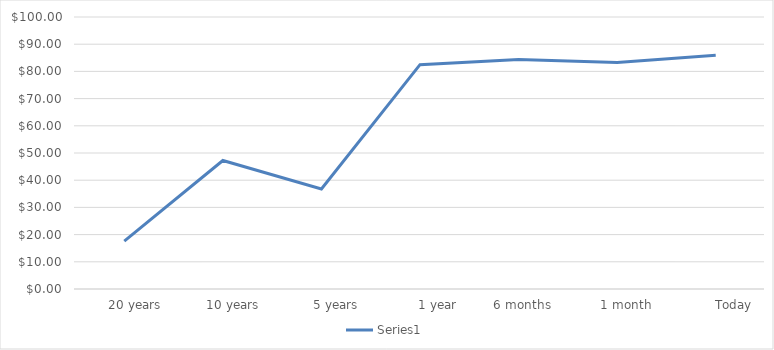
| Category | Series 0 |
|---|---|
|       20 years | 17.63 |
|       10 years | 47.24 |
|         5 years | 36.76 |
|           1 year | 82.47 |
|    6 months | 84.36 |
|      1 month | 83.31 |
|           Today | 85.95 |